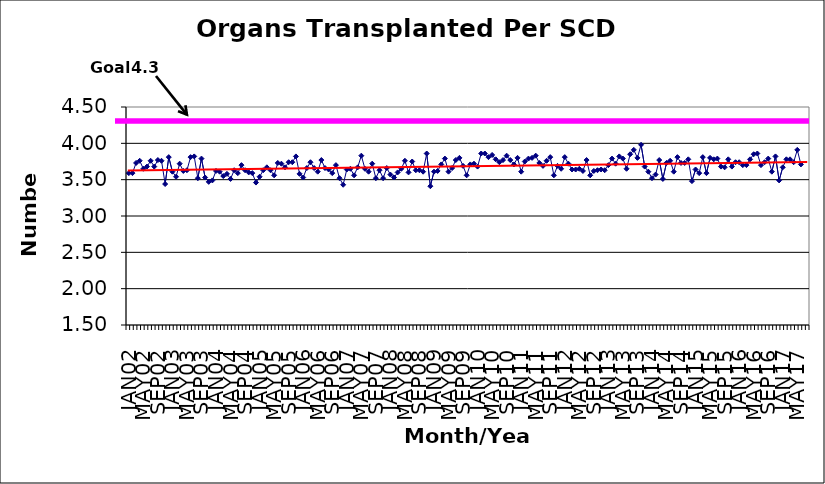
| Category | Series 0 |
|---|---|
| JAN02 | 3.59 |
| FEB02 | 3.59 |
| MAR02 | 3.73 |
| APR02 | 3.76 |
| MAY02 | 3.65 |
| JUN02 | 3.68 |
| JUL02 | 3.76 |
| AUG02 | 3.68 |
| SEP02 | 3.77 |
| OCT02 | 3.76 |
| NOV02 | 3.44 |
| DEC02 | 3.81 |
| JAN03 | 3.61 |
| FEB03 | 3.54 |
| MAR03 | 3.72 |
| APR03 | 3.62 |
| MAY03 | 3.63 |
| JUN03 | 3.81 |
| JUL03 | 3.82 |
| AUG03 | 3.52 |
| SEP03 | 3.79 |
| OCT03 | 3.53 |
| NOV03 | 3.47 |
| DEC03 | 3.49 |
| JAN04 | 3.62 |
| FEB04 | 3.61 |
| MAR04 | 3.55 |
| APR04 | 3.58 |
| MAY04 | 3.51 |
| JUN04 | 3.63 |
| JUL04 | 3.59 |
| AUG04 | 3.7 |
| SEP04 | 3.63 |
| OCT04 | 3.6 |
| NOV04 | 3.59 |
| DEC04 | 3.46 |
| JAN05 | 3.54 |
| FEB05 | 3.63 |
| MAR05 | 3.67 |
| APR05 | 3.63 |
| MAY05 | 3.56 |
| JUN05 | 3.73 |
| JUL05 | 3.72 |
| AUG05 | 3.67 |
| SEP05 | 3.74 |
| OCT05 | 3.74 |
| NOV05 | 3.82 |
| DEC05 | 3.58 |
| JAN06 | 3.53 |
| FEB06 | 3.66 |
| MAR06 | 3.74 |
| APR06 | 3.66 |
| MAY06 | 3.61 |
| JUN06 | 3.77 |
| JUL06 | 3.66 |
| AUG06 | 3.64 |
| SEP06 | 3.59 |
| OCT06 | 3.7 |
| NOV06 | 3.52 |
| DEC06 | 3.43 |
| JAN07 | 3.64 |
| FEB07 | 3.65 |
| MAR07 | 3.56 |
| APR07 | 3.67 |
| MAY07 | 3.83 |
| JUN07 | 3.65 |
| JUL07 | 3.61 |
| AUG07 | 3.72 |
| SEP07 | 3.52 |
| OCT07 | 3.63 |
| NOV07 | 3.52 |
| DEC07 | 3.66 |
| JAN08 | 3.57 |
| FEB08 | 3.53 |
| MAR08 | 3.6 |
| APR08 | 3.65 |
| MAY08 | 3.76 |
| JUN08 | 3.6 |
| JUL08 | 3.75 |
| AUG08 | 3.63 |
| SEP08 | 3.63 |
| OCT08 | 3.61 |
| NOV08 | 3.86 |
| DEC08 | 3.41 |
| JAN09 | 3.61 |
| FEB09 | 3.62 |
| MAR09 | 3.71 |
| APR09 | 3.79 |
| MAY09 | 3.61 |
| JUN09 | 3.66 |
| JUL09 | 3.77 |
| AUG09 | 3.8 |
| SEP09 | 3.69 |
| OCT09 | 3.56 |
| NOV09 | 3.71 |
| DEC09 | 3.72 |
| JAN10 | 3.68 |
| FEB10 | 3.86 |
| MAR10 | 3.86 |
| APR10 | 3.81 |
| MAY10 | 3.84 |
| JUN10 | 3.78 |
| JUL10 | 3.74 |
| AUG10 | 3.77 |
| SEP10 | 3.83 |
| OCT10 | 3.77 |
| NOV10 | 3.71 |
| DEC10 | 3.8 |
| JAN11 | 3.61 |
| FEB11 | 3.75 |
| MAR11 | 3.79 |
| APR11 | 3.8 |
| MAY11 | 3.83 |
| JUN11 | 3.73 |
| JUL11 | 3.69 |
| AUG11 | 3.76 |
| SEP11 | 3.81 |
| OCT11 | 3.56 |
| NOV11 | 3.69 |
| DEC11 | 3.65 |
| JAN12 | 3.81 |
| FEB12 | 3.72 |
| MAR12 | 3.64 |
| APR12 | 3.64 |
| MAY12 | 3.65 |
| JUN12 | 3.62 |
| JUL12 | 3.77 |
| AUG12 | 3.56 |
| SEP12 | 3.62 |
| OCT12 | 3.63 |
| NOV12 | 3.64 |
| DEC12 | 3.63 |
| JAN13 | 3.7 |
| FEB13 | 3.79 |
| MAR13 | 3.72 |
| APR13 | 3.82 |
| MAY13 | 3.79 |
| JUN13 | 3.65 |
| JUL13 | 3.85 |
| AUG13 | 3.91 |
| SEP13 | 3.8 |
| OCT13 | 3.98 |
| NOV13 | 3.68 |
| DEC13 | 3.61 |
| JAN14 | 3.52 |
| FEB14 | 3.57 |
| MAR14 | 3.77 |
| APR14 | 3.51 |
| MAY14 | 3.73 |
| JUN14 | 3.76 |
| JUL14 | 3.61 |
| AUG14 | 3.81 |
| SEP14 | 3.73 |
| OCT14 | 3.73 |
| NOV14 | 3.78 |
| DEC14 | 3.48 |
| JAN15 | 3.64 |
| FEB15 | 3.59 |
| MAR15 | 3.81 |
| APR15 | 3.59 |
| MAY15 | 3.8 |
| JUN15 | 3.78 |
| JUL15 | 3.79 |
| AUG15 | 3.68 |
| SEP15 | 3.67 |
| OCT15 | 3.78 |
| NOV15 | 3.68 |
| DEC15 | 3.74 |
| JAN16 | 3.74 |
| FEB16 | 3.7 |
| MAR16 | 3.7 |
| APR16 | 3.78 |
| MAY16 | 3.85 |
| JUN16 | 3.86 |
| JUL16 | 3.7 |
| AUG16 | 3.74 |
| SEP16 | 3.79 |
| OCT16 | 3.61 |
| NOV16 | 3.82 |
| DEC16 | 3.49 |
| JAN17 | 3.67 |
| FEB17 | 3.78 |
| MAR17 | 3.78 |
| APR17 | 3.74 |
| MAY17 | 3.91 |
| JUN17 | 3.71 |